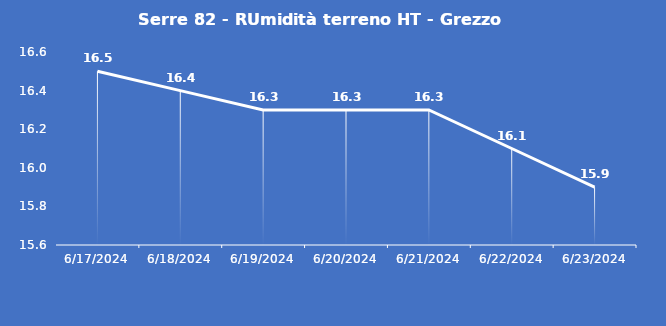
| Category | Serre 82 - RUmidità terreno HT - Grezzo (%VWC) |
|---|---|
| 6/17/24 | 16.5 |
| 6/18/24 | 16.4 |
| 6/19/24 | 16.3 |
| 6/20/24 | 16.3 |
| 6/21/24 | 16.3 |
| 6/22/24 | 16.1 |
| 6/23/24 | 15.9 |